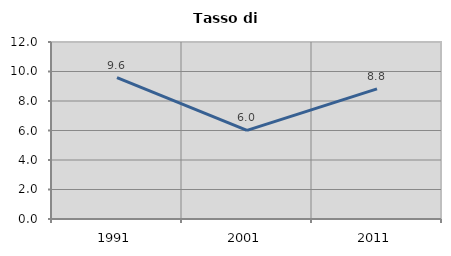
| Category | Tasso di disoccupazione   |
|---|---|
| 1991.0 | 9.582 |
| 2001.0 | 6.012 |
| 2011.0 | 8.819 |